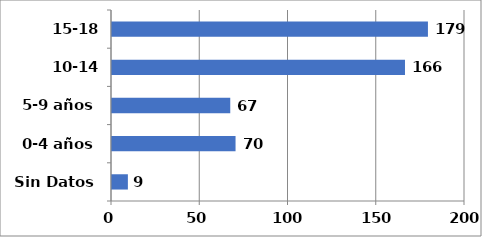
| Category | Series 0 |
|---|---|
| Sin Datos | 9 |
| 0-4 años | 70 |
| 5-9 años | 67 |
| 10-14 años | 166 |
| 15-18 años | 179 |